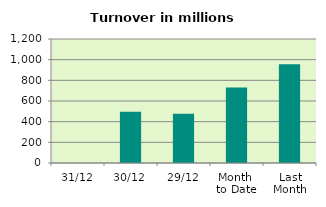
| Category | Series 0 |
|---|---|
| 31/12 | 0 |
| 30/12 | 497.091 |
| 29/12 | 476.647 |
| Month 
to Date | 730.935 |
| Last
Month | 954.978 |